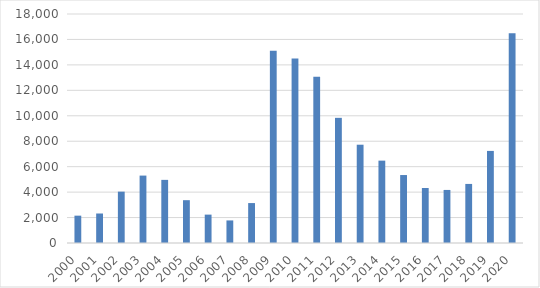
| Category | Series 0 |
|---|---|
| 2000.0 | 2149 |
| 2001.0 | 2319 |
| 2002.0 | 4037 |
| 2003.0 | 5299 |
| 2004.0 | 4962 |
| 2005.0 | 3366 |
| 2006.0 | 2231 |
| 2007.0 | 1774 |
| 2008.0 | 3139 |
| 2009.0 | 15121 |
| 2010.0 | 14503 |
| 2011.0 | 13066 |
| 2012.0 | 9838 |
| 2013.0 | 7726 |
| 2014.0 | 6474 |
| 2015.0 | 5342 |
| 2016.0 | 4324 |
| 2017.0 | 4171 |
| 2018.0 | 4643 |
| 2019.0 | 7238 |
| 2020.0 | 16496.333 |